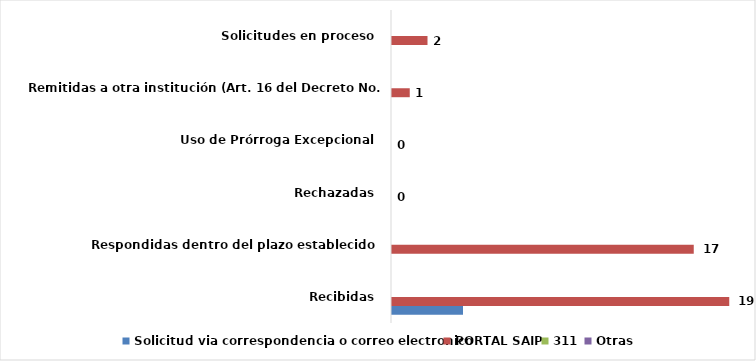
| Category | Solicitud via correspondencia o correo electronico | PORTAL SAIP | 311 | Otras |
|---|---|---|---|---|
| Recibidas  | 4 | 19 | 0 | 0 |
| Respondidas dentro del plazo establecido  | 0 | 17 | 0 | 0 |
| Rechazadas  | 0 | 0 | 0 | 0 |
| Uso de Prórroga Excepcional  | 0 | 0 | 0 | 0 |
| Remitidas a otra institución (Art. 16 del Decreto No. 130-05)  | 0 | 1 | 0 | 0 |
| Solicitudes en proceso  | 0 | 2 | 0 | 0 |